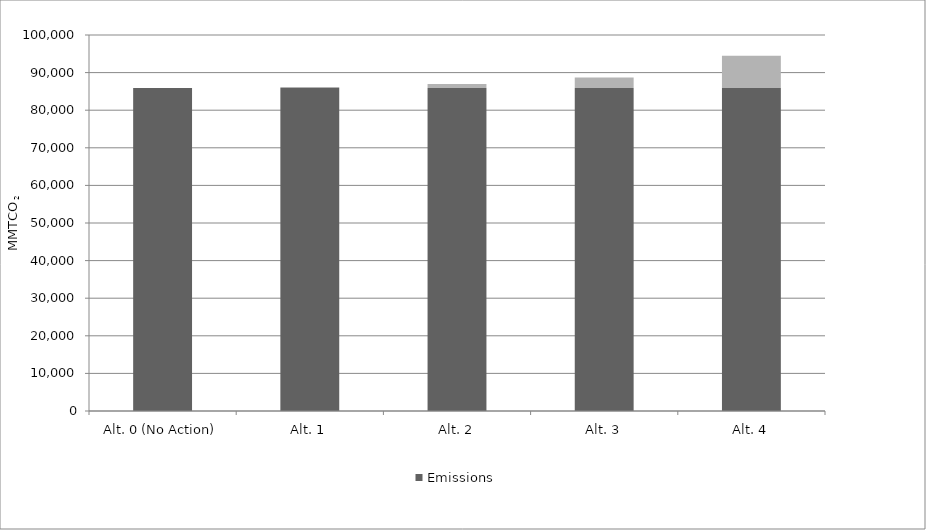
| Category | Emissions | Emissions Difference Compared to No Action Alternative |
|---|---|---|
| Alt. 0 (No Action) | 85900 | 0 |
| Alt. 1 | 85900 | 300 |
| Alt. 2 | 85900 | 1100 |
| Alt. 3 | 85900 | 2800 |
| Alt. 4 | 85900 | 8600 |